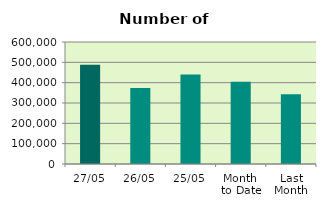
| Category | Series 0 |
|---|---|
| 27/05 | 487604 |
| 26/05 | 373170 |
| 25/05 | 439584 |
| Month 
to Date | 404246.471 |
| Last
Month | 343067.2 |